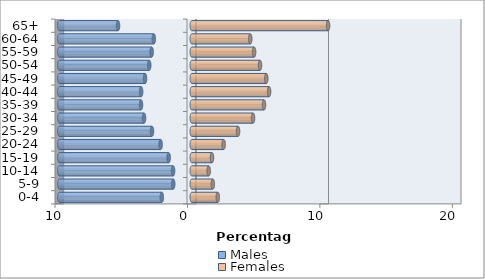
| Category | Males | Females |
|---|---|---|
| 0-4 | -2.262 | 1.963 |
| 5-9 | -1.4 | 1.589 |
| 10-14 | -1.412 | 1.279 |
| 15-19 | -1.744 | 1.526 |
| 20-24 | -2.351 | 2.405 |
| 25-29 | -3.006 | 3.494 |
| 30-34 | -3.604 | 4.625 |
| 35-39 | -3.833 | 5.452 |
| 40-44 | -3.825 | 5.838 |
| 45-49 | -3.528 | 5.625 |
| 50-54 | -3.212 | 5.152 |
| 55-59 | -3.029 | 4.705 |
| 60-64 | -2.867 | 4.415 |
| 65+ | -5.568 | 10.291 |